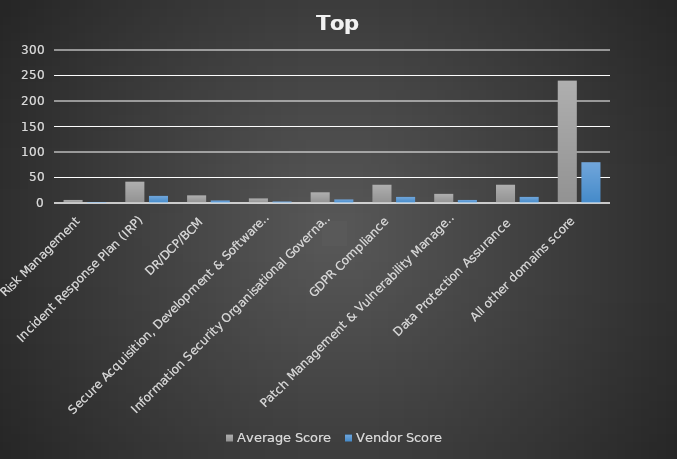
| Category | Average Score | Vendor Score |
|---|---|---|
| Risk Management | 6 | 2 |
| Incident Response Plan (IRP) | 42 | 14 |
| DR/DCP/BCM | 15 | 5 |
| Secure Acquisition, Development & Software Maintenance Secure (SDLC)  | 9 | 3 |
| Information Security Organisational Governance | 21 | 7 |
| GDPR Compliance | 36 | 12 |
| Patch Management & Vulnerability Management  | 18 | 6 |
| Data Protection Assurance  | 36 | 12 |
| All other domains score | 240 | 80 |